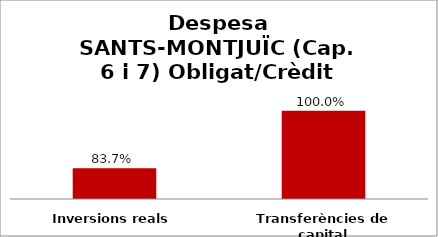
| Category | Series 0 |
|---|---|
| Inversions reals | 0.837 |
| Transferències de capital | 1 |